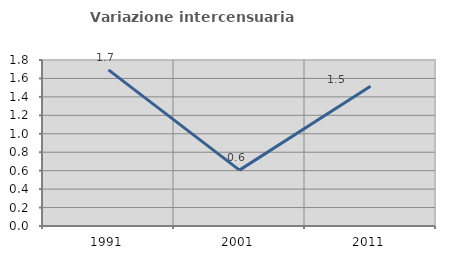
| Category | Variazione intercensuaria annua |
|---|---|
| 1991.0 | 1.693 |
| 2001.0 | 0.606 |
| 2011.0 | 1.515 |